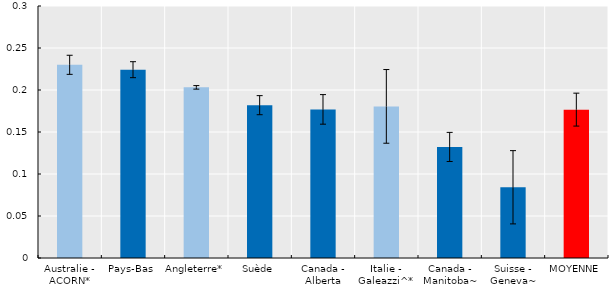
| Category | Series 0 |
|---|---|
| Australie - ACORN* | 0.23 |
| Pays-Bas | 0.224 |
| Angleterre* | 0.203 |
| Suède | 0.182 |
| Canada - Alberta | 0.177 |
| Italie - Galeazzi^* | 0.181 |
| Canada - Manitoba~ | 0.132 |
| Suisse - Geneva~ | 0.084 |
| MOYENNE | 0.177 |